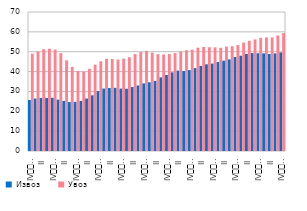
| Category | Извоз  | Увоз  |
|---|---|---|
| IV
2007. | 25.685 | 48.988 |
| I | 26.435 | 50.079 |
| II | 26.762 | 51.284 |
| III | 26.745 | 51.516 |
| IV
2008. | 26.815 | 51.116 |
| I | 25.895 | 49.29 |
| II | 25.249 | 45.652 |
| III | 24.656 | 42.354 |
| IV
2009. | 24.756 | 40.32 |
| I | 25.245 | 39.961 |
| II | 26.435 | 41.413 |
| III | 28.059 | 43.49 |
| IV
2010. | 30.174 | 45.17 |
| I | 31.45 | 46.443 |
| II | 31.688 | 46.344 |
| III | 31.841 | 46.086 |
| IV
2011. | 31.438 | 46.506 |
| I | 31.357 | 47.241 |
| II | 32.233 | 48.822 |
| III | 33.016 | 49.83 |
| IV
2012. | 34.052 | 50.45 |
| I | 34.607 | 49.528 |
| II | 35.308 | 48.789 |
| III | 37.081 | 48.635 |
| IV
2013. | 38.263 | 48.82 |
| I | 39.61 | 49.276 |
| II | 40.486 | 50.052 |
| III | 40.292 | 50.758 |
| IV
2014. | 40.743 | 51.021 |
| I | 41.753 | 52.012 |
| II | 42.869 | 52.412 |
| III | 43.67 | 52.242 |
| IV
2015. | 44.034 | 52.197 |
| I | 44.801 | 51.988 |
| II | 45.482 | 52.59 |
| III | 46.131 | 52.766 |
| IV
2016. | 47.342 | 53.366 |
| I | 48.013 | 54.597 |
| II | 48.893 | 55.523 |
| III | 49.328 | 56.197 |
| IV
2017. | 49.247 | 56.977 |
| I | 49.161 | 57.209 |
| II | 48.853 | 57.196 |
| III | 49.149 | 58.172 |
| IV
2018. | 49.644 | 59.353 |